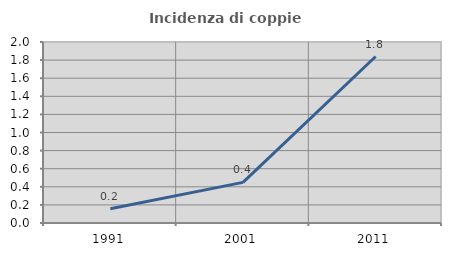
| Category | Incidenza di coppie miste |
|---|---|
| 1991.0 | 0.157 |
| 2001.0 | 0.449 |
| 2011.0 | 1.84 |